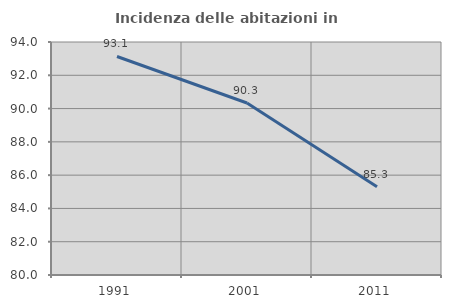
| Category | Incidenza delle abitazioni in proprietà  |
|---|---|
| 1991.0 | 93.13 |
| 2001.0 | 90.336 |
| 2011.0 | 85.308 |